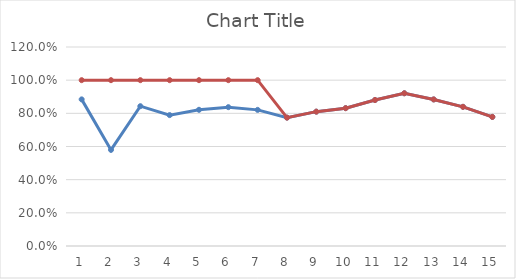
| Category | Series 0 | Series 1 |
|---|---|---|
| 0 | 0.884 | 1 |
| 1 | 0.58 | 1 |
| 2 | 0.843 | 1 |
| 3 | 0.789 | 1 |
| 4 | 0.821 | 1 |
| 5 | 0.837 | 1 |
| 6 | 0.821 | 1 |
| 7 | 0.774 | 0.774 |
| 8 | 0.81 | 0.81 |
| 9 | 0.831 | 0.831 |
| 10 | 0.88 | 0.88 |
| 11 | 0.921 | 0.921 |
| 12 | 0.884 | 0.884 |
| 13 | 0.839 | 0.839 |
| 14 | 0.778 | 0.778 |